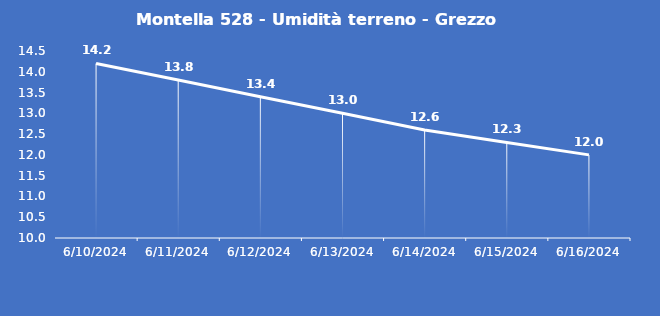
| Category | Montella 528 - Umidità terreno - Grezzo (%VWC) |
|---|---|
| 6/10/24 | 14.2 |
| 6/11/24 | 13.8 |
| 6/12/24 | 13.4 |
| 6/13/24 | 13 |
| 6/14/24 | 12.6 |
| 6/15/24 | 12.3 |
| 6/16/24 | 12 |